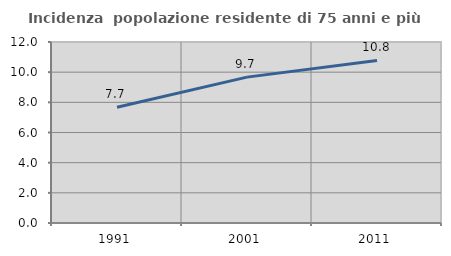
| Category | Incidenza  popolazione residente di 75 anni e più |
|---|---|
| 1991.0 | 7.672 |
| 2001.0 | 9.672 |
| 2011.0 | 10.774 |